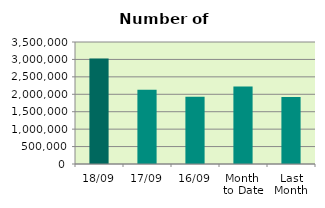
| Category | Series 0 |
|---|---|
| 18/09 | 3027358 |
| 17/09 | 2126546 |
| 16/09 | 1929138 |
| Month 
to Date | 2224914.571 |
| Last
Month | 1925290.095 |